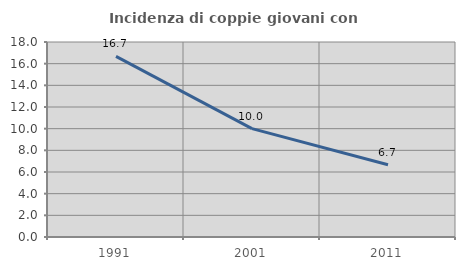
| Category | Incidenza di coppie giovani con figli |
|---|---|
| 1991.0 | 16.667 |
| 2001.0 | 10 |
| 2011.0 | 6.667 |